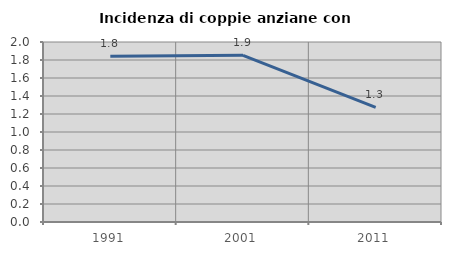
| Category | Incidenza di coppie anziane con figli |
|---|---|
| 1991.0 | 1.84 |
| 2001.0 | 1.852 |
| 2011.0 | 1.274 |